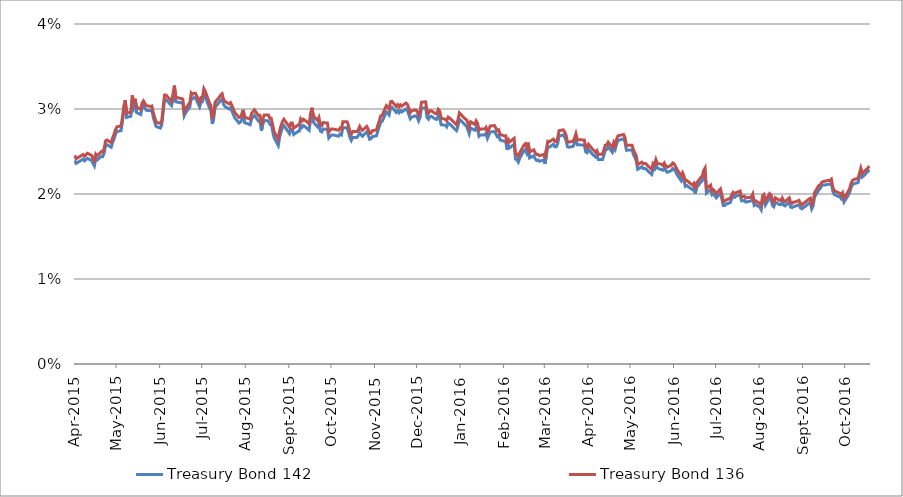
| Category | Treasury Bond 142 | Treasury Bond 136 |
|---|---|---|
| 2015-04-01 | 0.024 | 0.025 |
| 2015-04-02 | 0.024 | 0.024 |
| 2015-04-07 | 0.024 | 0.025 |
| 2015-04-08 | 0.024 | 0.024 |
| 2015-04-09 | 0.024 | 0.025 |
| 2015-04-10 | 0.024 | 0.025 |
| 2015-04-13 | 0.024 | 0.025 |
| 2015-04-14 | 0.024 | 0.024 |
| 2015-04-15 | 0.023 | 0.024 |
| 2015-04-16 | 0.024 | 0.025 |
| 2015-04-17 | 0.024 | 0.024 |
| 2015-04-20 | 0.024 | 0.025 |
| 2015-04-21 | 0.024 | 0.025 |
| 2015-04-22 | 0.025 | 0.025 |
| 2015-04-23 | 0.026 | 0.026 |
| 2015-04-24 | 0.026 | 0.026 |
| 2015-04-27 | 0.026 | 0.026 |
| 2015-04-28 | 0.026 | 0.027 |
| 2015-04-29 | 0.026 | 0.027 |
| 2015-04-30 | 0.027 | 0.028 |
| 2015-05-01 | 0.027 | 0.028 |
| 2015-05-04 | 0.027 | 0.028 |
| 2015-05-05 | 0.028 | 0.029 |
| 2015-05-06 | 0.03 | 0.03 |
| 2015-05-07 | 0.03 | 0.031 |
| 2015-05-08 | 0.029 | 0.03 |
| 2015-05-11 | 0.029 | 0.03 |
| 2015-05-12 | 0.031 | 0.032 |
| 2015-05-13 | 0.03 | 0.031 |
| 2015-05-14 | 0.031 | 0.031 |
| 2015-05-15 | 0.03 | 0.03 |
| 2015-05-18 | 0.029 | 0.03 |
| 2015-05-19 | 0.03 | 0.031 |
| 2015-05-20 | 0.03 | 0.031 |
| 2015-05-21 | 0.03 | 0.031 |
| 2015-05-22 | 0.03 | 0.03 |
| 2015-05-25 | 0.03 | 0.03 |
| 2015-05-26 | 0.03 | 0.03 |
| 2015-05-27 | 0.029 | 0.03 |
| 2015-05-28 | 0.028 | 0.029 |
| 2015-05-29 | 0.028 | 0.028 |
| 2015-06-01 | 0.028 | 0.028 |
| 2015-06-02 | 0.028 | 0.029 |
| 2015-06-03 | 0.03 | 0.03 |
| 2015-06-04 | 0.031 | 0.032 |
| 2015-06-05 | 0.031 | 0.032 |
| 2015-06-09 | 0.03 | 0.031 |
| 2015-06-10 | 0.031 | 0.032 |
| 2015-06-11 | 0.032 | 0.033 |
| 2015-06-12 | 0.031 | 0.031 |
| 2015-06-15 | 0.031 | 0.031 |
| 2015-06-16 | 0.031 | 0.031 |
| 2015-06-17 | 0.031 | 0.031 |
| 2015-06-18 | 0.029 | 0.03 |
| 2015-06-19 | 0.03 | 0.03 |
| 2015-06-22 | 0.03 | 0.031 |
| 2015-06-23 | 0.031 | 0.032 |
| 2015-06-24 | 0.031 | 0.032 |
| 2015-06-25 | 0.031 | 0.032 |
| 2015-06-26 | 0.031 | 0.032 |
| 2015-06-29 | 0.03 | 0.031 |
| 2015-06-30 | 0.031 | 0.031 |
| 2015-07-01 | 0.031 | 0.031 |
| 2015-07-02 | 0.032 | 0.032 |
| 2015-07-03 | 0.031 | 0.032 |
| 2015-07-06 | 0.03 | 0.031 |
| 2015-07-07 | 0.03 | 0.03 |
| 2015-07-08 | 0.028 | 0.029 |
| 2015-07-09 | 0.029 | 0.029 |
| 2015-07-10 | 0.03 | 0.031 |
| 2015-07-13 | 0.031 | 0.031 |
| 2015-07-14 | 0.031 | 0.032 |
| 2015-07-15 | 0.031 | 0.032 |
| 2015-07-16 | 0.031 | 0.031 |
| 2015-07-17 | 0.03 | 0.031 |
| 2015-07-20 | 0.03 | 0.031 |
| 2015-07-21 | 0.03 | 0.031 |
| 2015-07-22 | 0.03 | 0.03 |
| 2015-07-23 | 0.029 | 0.03 |
| 2015-07-24 | 0.029 | 0.03 |
| 2015-07-27 | 0.028 | 0.029 |
| 2015-07-28 | 0.028 | 0.029 |
| 2015-07-29 | 0.029 | 0.029 |
| 2015-07-30 | 0.029 | 0.03 |
| 2015-07-31 | 0.028 | 0.029 |
| 2015-08-04 | 0.028 | 0.029 |
| 2015-08-05 | 0.029 | 0.03 |
| 2015-08-06 | 0.029 | 0.03 |
| 2015-08-07 | 0.029 | 0.03 |
| 2015-08-10 | 0.029 | 0.029 |
| 2015-08-11 | 0.029 | 0.029 |
| 2015-08-12 | 0.027 | 0.028 |
| 2015-08-13 | 0.028 | 0.029 |
| 2015-08-14 | 0.029 | 0.029 |
| 2015-08-17 | 0.029 | 0.029 |
| 2015-08-18 | 0.028 | 0.029 |
| 2015-08-19 | 0.028 | 0.029 |
| 2015-08-20 | 0.027 | 0.028 |
| 2015-08-21 | 0.027 | 0.027 |
| 2015-08-24 | 0.026 | 0.026 |
| 2015-08-25 | 0.027 | 0.027 |
| 2015-08-26 | 0.027 | 0.028 |
| 2015-08-27 | 0.028 | 0.029 |
| 2015-08-28 | 0.028 | 0.029 |
| 2015-08-31 | 0.027 | 0.028 |
| 2015-09-01 | 0.027 | 0.028 |
| 2015-09-02 | 0.028 | 0.028 |
| 2015-09-03 | 0.028 | 0.028 |
| 2015-09-04 | 0.027 | 0.028 |
| 2015-09-07 | 0.027 | 0.028 |
| 2015-09-08 | 0.027 | 0.028 |
| 2015-09-09 | 0.028 | 0.029 |
| 2015-09-10 | 0.028 | 0.029 |
| 2015-09-11 | 0.028 | 0.029 |
| 2015-09-14 | 0.028 | 0.028 |
| 2015-09-15 | 0.028 | 0.028 |
| 2015-09-16 | 0.029 | 0.029 |
| 2015-09-17 | 0.029 | 0.03 |
| 2015-09-18 | 0.028 | 0.029 |
| 2015-09-21 | 0.028 | 0.029 |
| 2015-09-22 | 0.028 | 0.029 |
| 2015-09-23 | 0.027 | 0.028 |
| 2015-09-24 | 0.027 | 0.028 |
| 2015-09-25 | 0.028 | 0.028 |
| 2015-09-28 | 0.028 | 0.028 |
| 2015-09-29 | 0.027 | 0.027 |
| 2015-09-30 | 0.027 | 0.028 |
| 2015-10-01 | 0.027 | 0.028 |
| 2015-10-02 | 0.027 | 0.028 |
| 2015-10-06 | 0.027 | 0.028 |
| 2015-10-07 | 0.027 | 0.028 |
| 2015-10-08 | 0.027 | 0.028 |
| 2015-10-09 | 0.028 | 0.028 |
| 2015-10-12 | 0.028 | 0.028 |
| 2015-10-13 | 0.027 | 0.028 |
| 2015-10-14 | 0.027 | 0.027 |
| 2015-10-15 | 0.026 | 0.027 |
| 2015-10-16 | 0.027 | 0.027 |
| 2015-10-19 | 0.027 | 0.027 |
| 2015-10-20 | 0.027 | 0.028 |
| 2015-10-21 | 0.027 | 0.028 |
| 2015-10-22 | 0.027 | 0.028 |
| 2015-10-23 | 0.027 | 0.028 |
| 2015-10-26 | 0.027 | 0.028 |
| 2015-10-27 | 0.027 | 0.028 |
| 2015-10-28 | 0.026 | 0.027 |
| 2015-10-29 | 0.026 | 0.027 |
| 2015-10-30 | 0.027 | 0.027 |
| 2015-11-02 | 0.027 | 0.028 |
| 2015-11-03 | 0.027 | 0.028 |
| 2015-11-04 | 0.028 | 0.029 |
| 2015-11-05 | 0.028 | 0.029 |
| 2015-11-06 | 0.029 | 0.029 |
| 2015-11-09 | 0.03 | 0.03 |
| 2015-11-10 | 0.03 | 0.03 |
| 2015-11-11 | 0.029 | 0.03 |
| 2015-11-12 | 0.03 | 0.031 |
| 2015-11-13 | 0.03 | 0.031 |
| 2015-11-16 | 0.03 | 0.03 |
| 2015-11-17 | 0.03 | 0.03 |
| 2015-11-18 | 0.03 | 0.03 |
| 2015-11-19 | 0.03 | 0.03 |
| 2015-11-20 | 0.03 | 0.03 |
| 2015-11-23 | 0.03 | 0.031 |
| 2015-11-24 | 0.03 | 0.031 |
| 2015-11-25 | 0.029 | 0.03 |
| 2015-11-26 | 0.029 | 0.03 |
| 2015-11-27 | 0.029 | 0.03 |
| 2015-11-30 | 0.029 | 0.03 |
| 2015-12-01 | 0.029 | 0.03 |
| 2015-12-02 | 0.029 | 0.029 |
| 2015-12-03 | 0.029 | 0.03 |
| 2015-12-04 | 0.03 | 0.031 |
| 2015-12-07 | 0.03 | 0.031 |
| 2015-12-08 | 0.029 | 0.03 |
| 2015-12-09 | 0.029 | 0.03 |
| 2015-12-10 | 0.029 | 0.03 |
| 2015-12-11 | 0.029 | 0.03 |
| 2015-12-14 | 0.029 | 0.029 |
| 2015-12-15 | 0.029 | 0.03 |
| 2015-12-16 | 0.029 | 0.03 |
| 2015-12-17 | 0.029 | 0.03 |
| 2015-12-18 | 0.028 | 0.029 |
| 2015-12-21 | 0.028 | 0.029 |
| 2015-12-22 | 0.028 | 0.029 |
| 2015-12-23 | 0.028 | 0.029 |
| 2015-12-24 | 0.028 | 0.029 |
| 2015-12-29 | 0.027 | 0.028 |
| 2015-12-30 | 0.028 | 0.029 |
| 2015-12-31 | 0.029 | 0.03 |
| 2016-01-04 | 0.028 | 0.029 |
| 2016-01-05 | 0.028 | 0.029 |
| 2016-01-06 | 0.028 | 0.028 |
| 2016-01-07 | 0.027 | 0.028 |
| 2016-01-08 | 0.028 | 0.028 |
| 2016-01-11 | 0.028 | 0.028 |
| 2016-01-12 | 0.028 | 0.029 |
| 2016-01-13 | 0.028 | 0.028 |
| 2016-01-14 | 0.027 | 0.028 |
| 2016-01-15 | 0.027 | 0.028 |
| 2016-01-18 | 0.027 | 0.028 |
| 2016-01-19 | 0.027 | 0.028 |
| 2016-01-20 | 0.027 | 0.027 |
| 2016-01-21 | 0.027 | 0.028 |
| 2016-01-22 | 0.027 | 0.028 |
| 2016-01-25 | 0.027 | 0.028 |
| 2016-01-27 | 0.027 | 0.027 |
| 2016-01-28 | 0.027 | 0.028 |
| 2016-01-29 | 0.026 | 0.027 |
| 2016-02-01 | 0.026 | 0.027 |
| 2016-02-02 | 0.026 | 0.027 |
| 2016-02-03 | 0.025 | 0.026 |
| 2016-02-04 | 0.026 | 0.026 |
| 2016-02-05 | 0.025 | 0.026 |
| 2016-02-08 | 0.026 | 0.027 |
| 2016-02-09 | 0.024 | 0.025 |
| 2016-02-10 | 0.024 | 0.025 |
| 2016-02-11 | 0.024 | 0.024 |
| 2016-02-12 | 0.024 | 0.025 |
| 2016-02-15 | 0.025 | 0.026 |
| 2016-02-16 | 0.025 | 0.026 |
| 2016-02-17 | 0.025 | 0.026 |
| 2016-02-18 | 0.025 | 0.026 |
| 2016-02-19 | 0.024 | 0.025 |
| 2016-02-22 | 0.024 | 0.025 |
| 2016-02-23 | 0.024 | 0.025 |
| 2016-02-24 | 0.024 | 0.025 |
| 2016-02-25 | 0.024 | 0.025 |
| 2016-02-26 | 0.024 | 0.024 |
| 2016-02-29 | 0.024 | 0.025 |
| 2016-03-01 | 0.024 | 0.024 |
| 2016-03-02 | 0.025 | 0.025 |
| 2016-03-03 | 0.026 | 0.026 |
| 2016-03-04 | 0.026 | 0.026 |
| 2016-03-07 | 0.026 | 0.026 |
| 2016-03-08 | 0.026 | 0.026 |
| 2016-03-09 | 0.026 | 0.026 |
| 2016-03-10 | 0.026 | 0.027 |
| 2016-03-11 | 0.027 | 0.027 |
| 2016-03-14 | 0.027 | 0.028 |
| 2016-03-15 | 0.027 | 0.027 |
| 2016-03-16 | 0.026 | 0.027 |
| 2016-03-17 | 0.026 | 0.026 |
| 2016-03-18 | 0.026 | 0.026 |
| 2016-03-21 | 0.026 | 0.026 |
| 2016-03-22 | 0.026 | 0.027 |
| 2016-03-23 | 0.026 | 0.027 |
| 2016-03-24 | 0.026 | 0.026 |
| 2016-03-29 | 0.026 | 0.026 |
| 2016-03-30 | 0.025 | 0.026 |
| 2016-03-31 | 0.025 | 0.025 |
| 2016-04-01 | 0.025 | 0.026 |
| 2016-04-04 | 0.025 | 0.025 |
| 2016-04-05 | 0.024 | 0.025 |
| 2016-04-06 | 0.024 | 0.025 |
| 2016-04-07 | 0.025 | 0.025 |
| 2016-04-08 | 0.024 | 0.025 |
| 2016-04-11 | 0.024 | 0.025 |
| 2016-04-12 | 0.025 | 0.025 |
| 2016-04-13 | 0.025 | 0.026 |
| 2016-04-14 | 0.025 | 0.026 |
| 2016-04-15 | 0.026 | 0.026 |
| 2016-04-18 | 0.025 | 0.025 |
| 2016-04-19 | 0.026 | 0.026 |
| 2016-04-20 | 0.025 | 0.026 |
| 2016-04-21 | 0.026 | 0.026 |
| 2016-04-22 | 0.026 | 0.027 |
| 2016-04-26 | 0.026 | 0.027 |
| 2016-04-27 | 0.026 | 0.027 |
| 2016-04-28 | 0.025 | 0.026 |
| 2016-04-29 | 0.025 | 0.026 |
| 2016-05-02 | 0.025 | 0.026 |
| 2016-05-03 | 0.025 | 0.025 |
| 2016-05-04 | 0.024 | 0.025 |
| 2016-05-05 | 0.024 | 0.024 |
| 2016-05-06 | 0.023 | 0.023 |
| 2016-05-09 | 0.023 | 0.024 |
| 2016-05-10 | 0.023 | 0.024 |
| 2016-05-11 | 0.023 | 0.024 |
| 2016-05-12 | 0.023 | 0.024 |
| 2016-05-13 | 0.023 | 0.023 |
| 2016-05-16 | 0.022 | 0.023 |
| 2016-05-17 | 0.023 | 0.024 |
| 2016-05-18 | 0.023 | 0.023 |
| 2016-05-19 | 0.024 | 0.024 |
| 2016-05-20 | 0.023 | 0.024 |
| 2016-05-23 | 0.023 | 0.024 |
| 2016-05-24 | 0.023 | 0.023 |
| 2016-05-25 | 0.023 | 0.024 |
| 2016-05-26 | 0.023 | 0.023 |
| 2016-05-27 | 0.023 | 0.023 |
| 2016-05-30 | 0.023 | 0.023 |
| 2016-05-31 | 0.023 | 0.024 |
| 2016-06-01 | 0.023 | 0.024 |
| 2016-06-02 | 0.023 | 0.023 |
| 2016-06-03 | 0.022 | 0.023 |
| 2016-06-06 | 0.022 | 0.022 |
| 2016-06-07 | 0.022 | 0.022 |
| 2016-06-08 | 0.022 | 0.022 |
| 2016-06-09 | 0.021 | 0.022 |
| 2016-06-10 | 0.021 | 0.022 |
| 2016-06-14 | 0.02 | 0.021 |
| 2016-06-15 | 0.021 | 0.021 |
| 2016-06-16 | 0.02 | 0.021 |
| 2016-06-17 | 0.021 | 0.021 |
| 2016-06-20 | 0.021 | 0.022 |
| 2016-06-21 | 0.022 | 0.022 |
| 2016-06-22 | 0.022 | 0.023 |
| 2016-06-23 | 0.022 | 0.023 |
| 2016-06-24 | 0.02 | 0.021 |
| 2016-06-27 | 0.021 | 0.021 |
| 2016-06-28 | 0.02 | 0.02 |
| 2016-06-29 | 0.02 | 0.02 |
| 2016-06-30 | 0.02 | 0.02 |
| 2016-07-01 | 0.02 | 0.02 |
| 2016-07-04 | 0.02 | 0.021 |
| 2016-07-05 | 0.019 | 0.02 |
| 2016-07-06 | 0.019 | 0.019 |
| 2016-07-07 | 0.019 | 0.019 |
| 2016-07-08 | 0.019 | 0.019 |
| 2016-07-11 | 0.019 | 0.02 |
| 2016-07-12 | 0.019 | 0.02 |
| 2016-07-13 | 0.02 | 0.02 |
| 2016-07-14 | 0.02 | 0.02 |
| 2016-07-15 | 0.02 | 0.02 |
| 2016-07-18 | 0.02 | 0.02 |
| 2016-07-19 | 0.019 | 0.02 |
| 2016-07-20 | 0.019 | 0.02 |
| 2016-07-21 | 0.019 | 0.02 |
| 2016-07-22 | 0.019 | 0.02 |
| 2016-07-25 | 0.019 | 0.02 |
| 2016-07-26 | 0.019 | 0.02 |
| 2016-07-27 | 0.02 | 0.02 |
| 2016-07-28 | 0.019 | 0.019 |
| 2016-07-29 | 0.019 | 0.019 |
| 2016-08-01 | 0.018 | 0.019 |
| 2016-08-02 | 0.018 | 0.019 |
| 2016-08-03 | 0.019 | 0.02 |
| 2016-08-04 | 0.019 | 0.02 |
| 2016-08-05 | 0.019 | 0.019 |
| 2016-08-08 | 0.02 | 0.02 |
| 2016-08-09 | 0.019 | 0.02 |
| 2016-08-10 | 0.019 | 0.019 |
| 2016-08-11 | 0.019 | 0.019 |
| 2016-08-12 | 0.019 | 0.02 |
| 2016-08-15 | 0.019 | 0.019 |
| 2016-08-16 | 0.019 | 0.019 |
| 2016-08-17 | 0.019 | 0.02 |
| 2016-08-18 | 0.019 | 0.019 |
| 2016-08-19 | 0.019 | 0.019 |
| 2016-08-22 | 0.019 | 0.02 |
| 2016-08-23 | 0.018 | 0.019 |
| 2016-08-24 | 0.018 | 0.019 |
| 2016-08-25 | 0.019 | 0.019 |
| 2016-08-26 | 0.019 | 0.019 |
| 2016-08-29 | 0.019 | 0.019 |
| 2016-08-30 | 0.018 | 0.019 |
| 2016-08-31 | 0.018 | 0.019 |
| 2016-09-01 | 0.018 | 0.019 |
| 2016-09-02 | 0.019 | 0.019 |
| 2016-09-05 | 0.019 | 0.019 |
| 2016-09-06 | 0.019 | 0.02 |
| 2016-09-07 | 0.018 | 0.019 |
| 2016-09-08 | 0.019 | 0.019 |
| 2016-09-09 | 0.02 | 0.02 |
| 2016-09-12 | 0.02 | 0.021 |
| 2016-09-13 | 0.021 | 0.021 |
| 2016-09-14 | 0.021 | 0.021 |
| 2016-09-15 | 0.021 | 0.021 |
| 2016-09-16 | 0.021 | 0.022 |
| 2016-09-19 | 0.021 | 0.022 |
| 2016-09-20 | 0.021 | 0.022 |
| 2016-09-21 | 0.021 | 0.022 |
| 2016-09-22 | 0.02 | 0.021 |
| 2016-09-23 | 0.02 | 0.02 |
| 2016-09-26 | 0.02 | 0.02 |
| 2016-09-27 | 0.02 | 0.02 |
| 2016-09-28 | 0.019 | 0.02 |
| 2016-09-29 | 0.02 | 0.02 |
| 2016-09-30 | 0.019 | 0.02 |
| 2016-10-03 | 0.02 | 0.02 |
| 2016-10-04 | 0.02 | 0.021 |
| 2016-10-05 | 0.021 | 0.021 |
| 2016-10-06 | 0.021 | 0.022 |
| 2016-10-07 | 0.021 | 0.022 |
| 2016-10-10 | 0.021 | 0.022 |
| 2016-10-11 | 0.022 | 0.022 |
| 2016-10-12 | 0.023 | 0.023 |
| 2016-10-13 | 0.022 | 0.022 |
| 2016-10-14 | 0.022 | 0.023 |
| 2016-10-17 | 0.023 | 0.023 |
| 2016-10-18 | 0.023 | 0.023 |